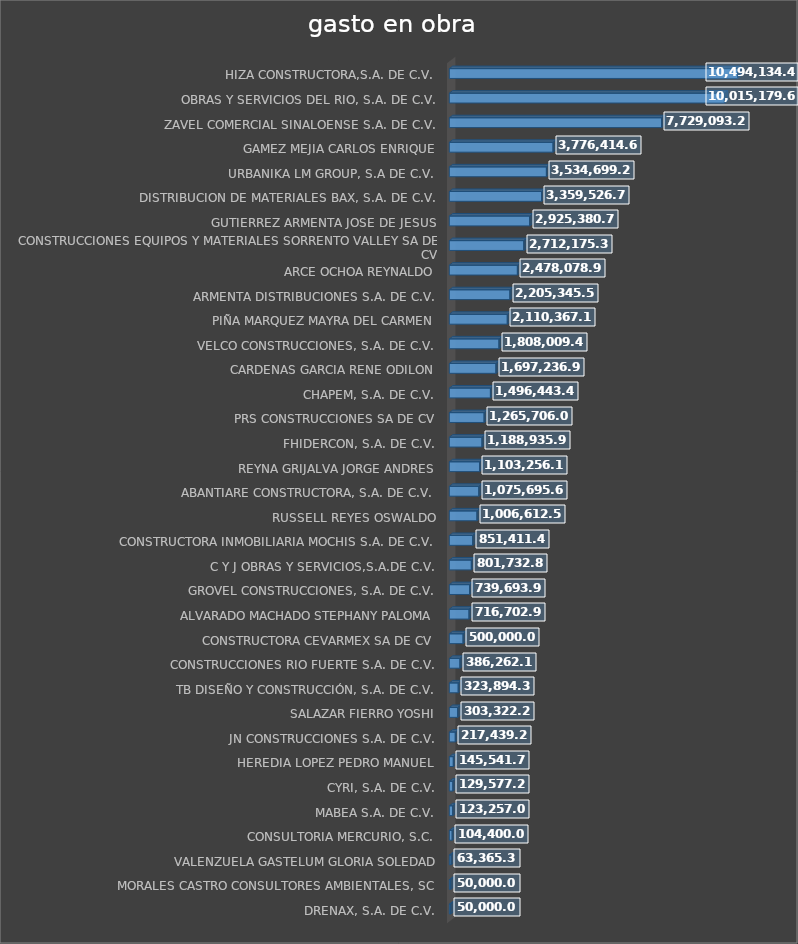
| Category | Suma |
|---|---|
| DRENAX, S.A. DE C.V. | 50000 |
| MORALES CASTRO CONSULTORES AMBIENTALES, SC | 50000 |
| VALENZUELA GASTELUM GLORIA SOLEDAD | 63365.36 |
| CONSULTORIA MERCURIO, S.C. | 104400 |
| MABEA S.A. DE C.V. | 123257.09 |
| CYRI, S.A. DE C.V. | 129577.2 |
| HEREDIA LOPEZ PEDRO MANUEL | 145541.71 |
| JN CONSTRUCCIONES S.A. DE C.V. | 217439.21 |
| SALAZAR FIERRO YOSHI | 303322.28 |
| TB DISEÑO Y CONSTRUCCIÓN, S.A. DE C.V. | 323894.33 |
| CONSTRUCCIONES RIO FUERTE S.A. DE C.V. | 386262.15 |
| CONSTRUCTORA CEVARMEX SA DE CV | 500000 |
| ALVARADO MACHADO STEPHANY PALOMA | 716702.93 |
| GROVEL CONSTRUCCIONES, S.A. DE C.V. | 739693.95 |
| C Y J OBRAS Y SERVICIOS,S.A.DE C.V. | 801732.82 |
| CONSTRUCTORA INMOBILIARIA MOCHIS S.A. DE C.V. | 851411.43 |
| RUSSELL REYES OSWALDO | 1006612.5 |
| ABANTIARE CONSTRUCTORA, S.A. DE C.V. | 1075695.6 |
| REYNA GRIJALVA JORGE ANDRES | 1103256.12 |
| FHIDERCON, S.A. DE C.V. | 1188935.93 |
| PRS CONSTRUCCIONES SA DE CV | 1265706.06 |
| CHAPEM, S.A. DE C.V. | 1496443.46 |
| CARDENAS GARCIA RENE ODILON | 1697236.98 |
| VELCO CONSTRUCCIONES, S.A. DE C.V. | 1808009.41 |
| PIÑA MARQUEZ MAYRA DEL CARMEN | 2110367.14 |
| ARMENTA DISTRIBUCIONES S.A. DE C.V. | 2205345.51 |
| ARCE OCHOA REYNALDO | 2478078.93 |
| CONSTRUCCIONES EQUIPOS Y MATERIALES SORRENTO VALLEY SA DE CV | 2712175.36 |
| GUTIERREZ ARMENTA JOSE DE JESUS | 2925380.7 |
| DISTRIBUCION DE MATERIALES BAX, S.A. DE C.V. | 3359526.78 |
| URBANIKA LM GROUP, S.A DE C.V. | 3534699.29 |
| GAMEZ MEJIA CARLOS ENRIQUE | 3776414.65 |
| ZAVEL COMERCIAL SINALOENSE S.A. DE C.V. | 7729093.23 |
| OBRAS Y SERVICIOS DEL RIO, S.A. DE C.V. | 10015179.68 |
| HIZA CONSTRUCTORA,S.A. DE C.V. | 10494134.42 |